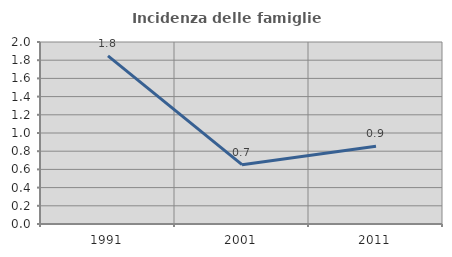
| Category | Incidenza delle famiglie numerose |
|---|---|
| 1991.0 | 1.848 |
| 2001.0 | 0.652 |
| 2011.0 | 0.854 |